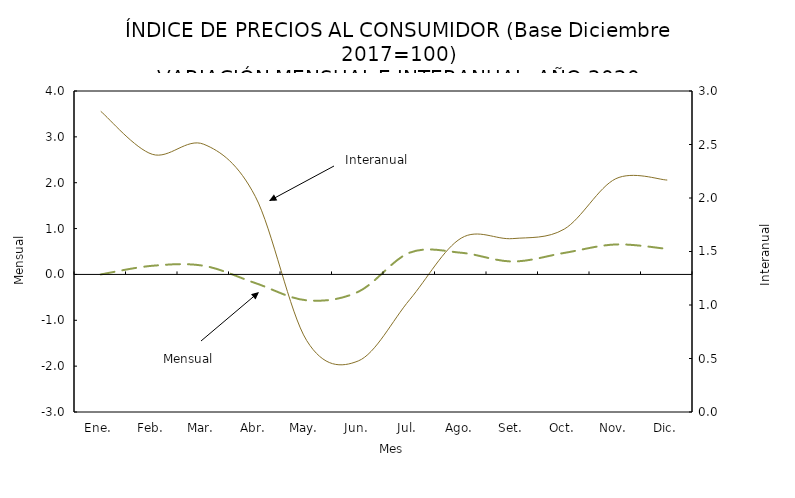
| Category | Mensual |
|---|---|
| Ene. | 0 |
| Feb. | 0.189 |
| Mar. | 0.188 |
| Abr. | -0.188 |
| May. | -0.564 |
| Jun. | -0.378 |
| Jul. | 0.475 |
| Ago. | 0.473 |
| Set. | 0.282 |
| Oct. | 0.469 |
| Nov. | 0.654 |
| Dic. | 0.557 |